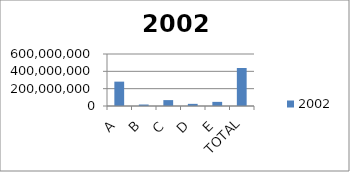
| Category | 2002 |
|---|---|
| A | 281096000 |
| B | 17015250 |
| C | 67996000 |
| D | 24748000 |
| E | 47685250 |
| TOTAL | 438542502 |